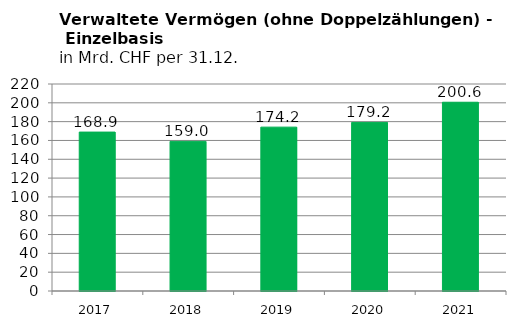
| Category | Verwaltete Vermögen (ohne Doppelzählungen) in Mrd. CHF |
|---|---|
| 2017.0 | 168.889 |
| 2018.0 | 159.018 |
| 2019.0 | 174.165 |
| 2020.0 | 179.177 |
| 2021.0 | 200.612 |